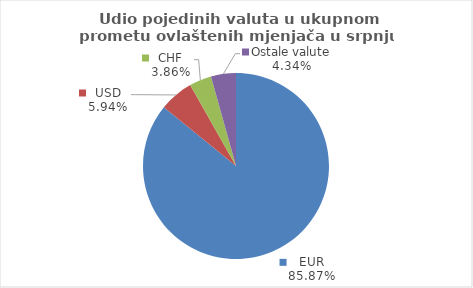
| Category | Series 0 |
|---|---|
| EUR | 85.867 |
| USD | 5.939 |
| CHF | 3.86 |
| Ostale valute | 4.335 |